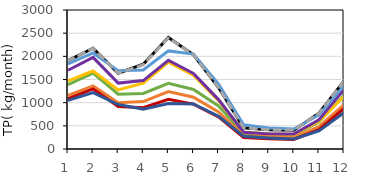
| Category | Baseline | GW | CBS | WASCOB | NRW | FP | GW + CBS | GW + CBS + WASCOB | All ACPs |
|---|---|---|---|---|---|---|---|---|---|
| 1.0 | 1909 | 1391.641 | 1471.589 | 1700.278 | 1837.746 | 1906.543 | 1158.53 | 1085.405 | 1050.765 |
| 2.0 | 2173.927 | 1636.154 | 1682.149 | 1975.873 | 2073.703 | 2171.022 | 1363.673 | 1297.584 | 1218.954 |
| 3.0 | 1636.157 | 1182.203 | 1275.059 | 1423.019 | 1688.535 | 1637.146 | 997.497 | 917.972 | 960.151 |
| 4.0 | 1828.327 | 1197.638 | 1421.176 | 1477.086 | 1703.749 | 1818.338 | 1024.043 | 892.357 | 856.784 |
| 5.0 | 2405.348 | 1416.387 | 1874.65 | 1915.058 | 2116.918 | 2401.079 | 1238.885 | 1072.05 | 983.394 |
| 6.0 | 2032.951 | 1283.939 | 1592.114 | 1632.703 | 2048.635 | 2030.404 | 1117.812 | 968.941 | 972.623 |
| 7.0 | 1327.626 | 929.904 | 1044.297 | 1066.4 | 1400.635 | 1327.599 | 801.192 | 691.614 | 707.904 |
| 8.0 | 459.129 | 338.912 | 364.412 | 362.579 | 524.182 | 460.538 | 290.452 | 246.143 | 275.082 |
| 9.0 | 413.795 | 309.673 | 326.069 | 323.921 | 453.566 | 414.633 | 262.984 | 221.701 | 239.561 |
| 10.0 | 405.703 | 295.187 | 311.32 | 321.686 | 430.137 | 407.176 | 245.347 | 207.04 | 215.575 |
| 11.0 | 771.714 | 582.526 | 597.103 | 630.694 | 738 | 771.976 | 484.024 | 418.2 | 390.137 |
| 12.0 | 1463.643 | 1161.284 | 1135.722 | 1283.195 | 1367.195 | 1461.814 | 956.688 | 875.691 | 783.134 |